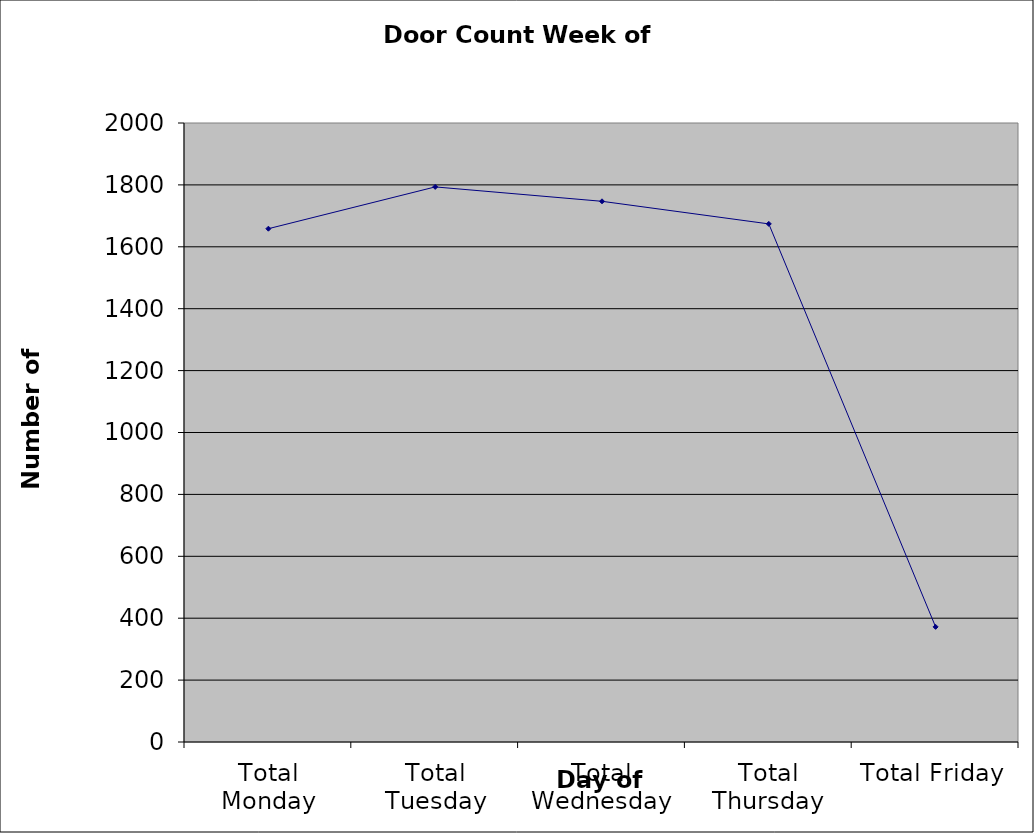
| Category | Series 0 |
|---|---|
| Total Monday | 1658.5 |
| Total Tuesday | 1793.5 |
| Total Wednesday | 1747 |
| Total Thursday | 1674 |
| Total Friday | 372 |